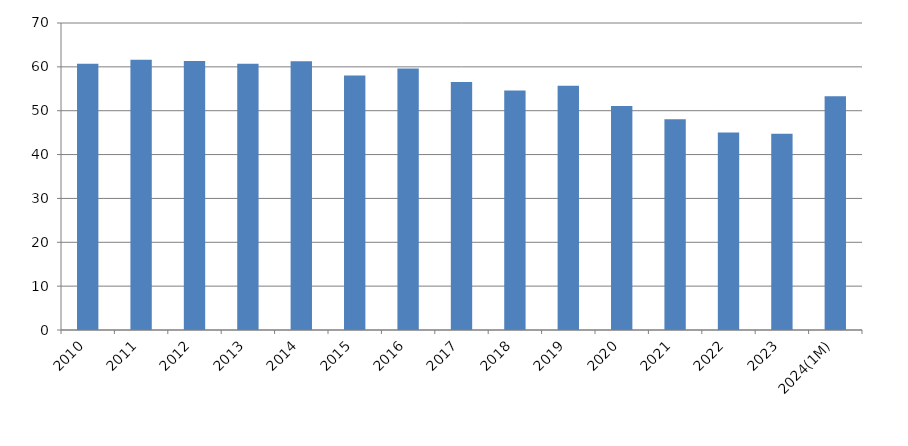
| Category | TPES Self-sufficiency ratio |
|---|---|
| 2010 | 60.701 |
| 2011 | 61.632 |
| 2012 | 61.312 |
| 2013 | 60.694 |
| 2014 | 61.259 |
| 2015 | 58.037 |
| 2016 | 59.624 |
| 2017 | 56.521 |
| 2018 | 54.597 |
| 2019 | 55.677 |
| 2020 | 51.075 |
| 2021 | 48.051 |
| 2022 | 45.047 |
| 2023 | 44.751 |
| 2024(1M) | 53.292 |